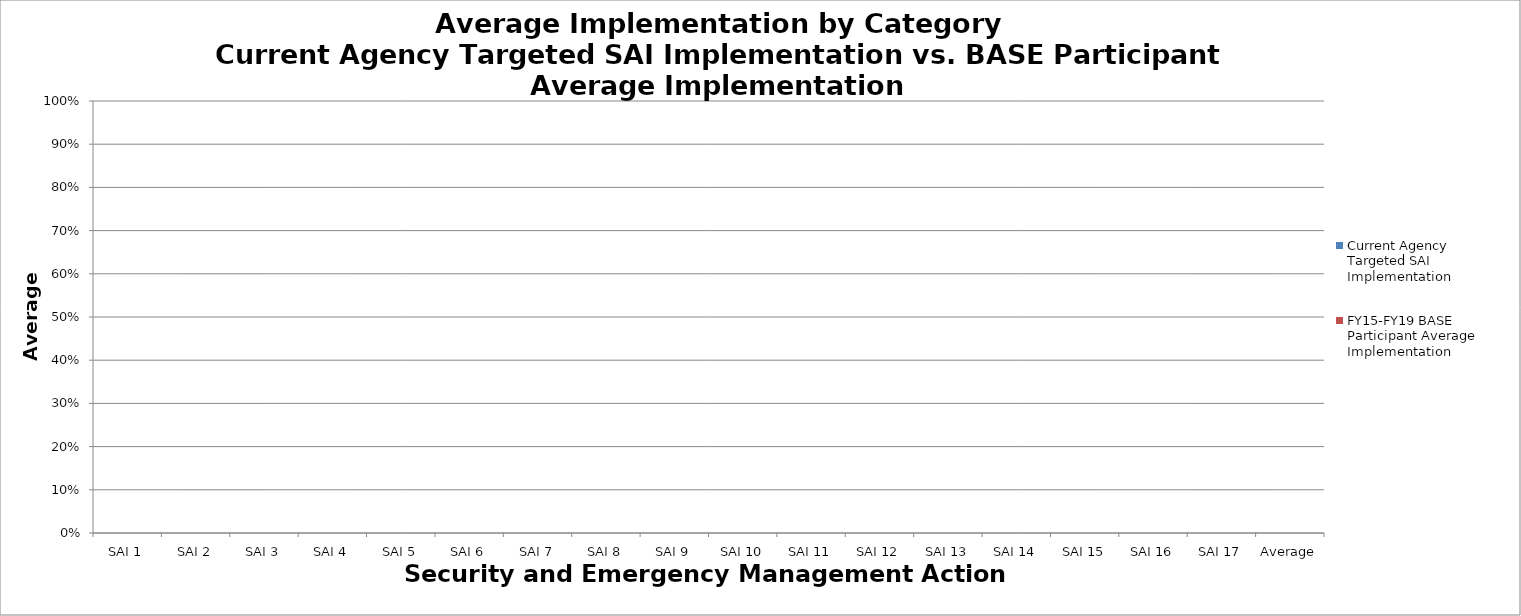
| Category | Current Agency Targeted SAI Implementation | FY15-FY19 BASE Participant Average Implementation |
|---|---|---|
| SAI 1 | 0 | 0 |
| SAI 2 | 0 | 0 |
| SAI 3 | 0 | 0 |
| SAI 4 | 0 | 0 |
| SAI 5 | 0 | 0 |
| SAI 6 | 0 | 0 |
| SAI 7 | 0 | 0 |
| SAI 8 | 0 | 0 |
| SAI 9 | 0 | 0 |
| SAI 10 | 0 | 0 |
| SAI 11 | 0 | 0 |
| SAI 12 | 0 | 0 |
| SAI 13 | 0 | 0 |
| SAI 14 | 0 | 0 |
| SAI 15 | 0 | 0 |
| SAI 16 | 0 | 0 |
| SAI 17 | 0 | 0 |
| Average | 0 | 0 |